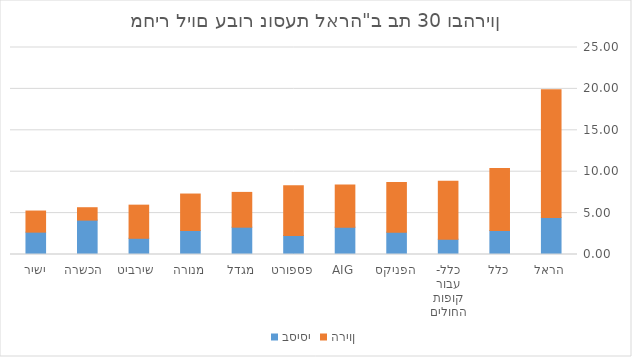
| Category | בסיסי | הריון |
|---|---|---|
| הראל | 4.48 | 15.43 |
| כלל | 2.9 | 7.5 |
| כלל- עבור קופות החולים | 1.847 | 7 |
| הפניקס | 2.7 | 6 |
| AIG | 3.3 | 5.1 |
| פספורט | 2.3 | 6 |
| מגדל | 3.3 | 4.2 |
| מנורה | 2.901 | 4.403 |
| שירביט  | 1.96 | 4 |
| הכשרה  | 4.15 | 1.5 |
| ישיר | 2.7 | 2.55 |